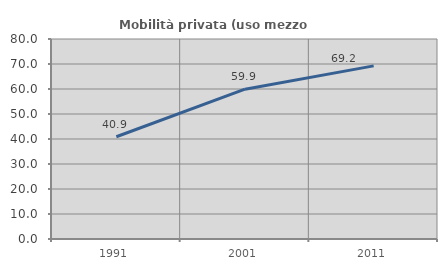
| Category | Mobilità privata (uso mezzo privato) |
|---|---|
| 1991.0 | 40.897 |
| 2001.0 | 59.923 |
| 2011.0 | 69.246 |